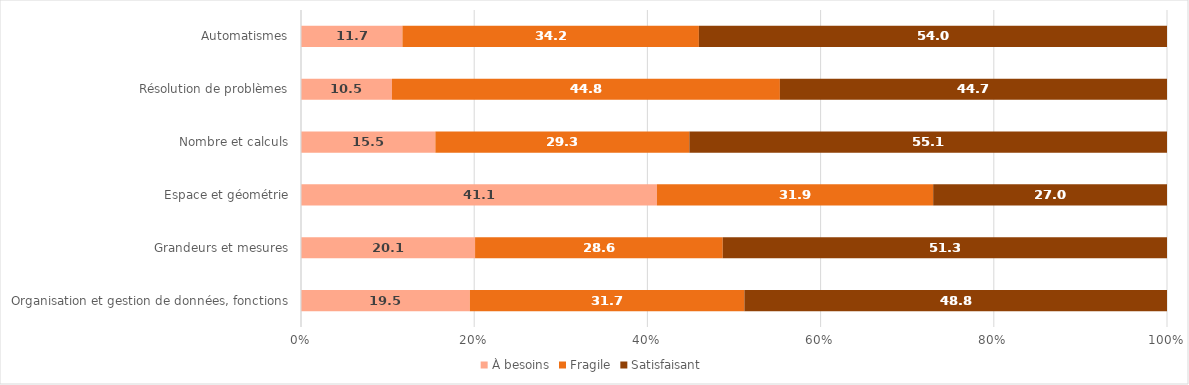
| Category | À besoins | Fragile | Satisfaisant |
|---|---|---|---|
| Automatismes | 11.7 | 34.2 | 54 |
| Résolution de problèmes | 10.5 | 44.8 | 44.7 |
| Nombre et calculs | 15.5 | 29.3 | 55.1 |
| Espace et géométrie | 41.1 | 31.9 | 27 |
| Grandeurs et mesures | 20.1 | 28.6 | 51.3 |
| Organisation et gestion de données, fonctions | 19.5 | 31.7 | 48.8 |